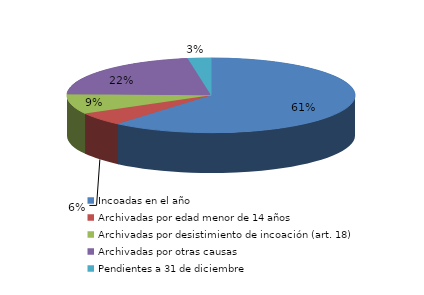
| Category | Series 0 |
|---|---|
| Incoadas en el año | 874 |
| Archivadas por edad menor de 14 años | 82 |
| Archivadas por desistimiento de incoación (art. 18) | 123 |
| Archivadas por otras causas | 313 |
| Pendientes a 31 de diciembre | 37 |